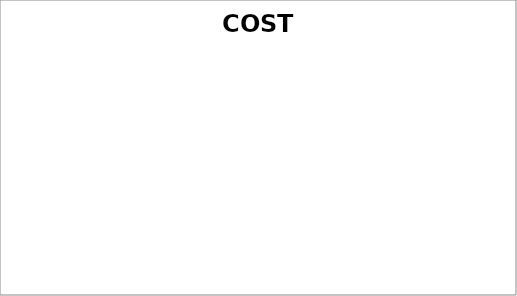
| Category | Series 0 |
|---|---|
| Purchasing cost | 0 |
| Pre-treatment costs | 0 |
| Personnel cost | 0 |